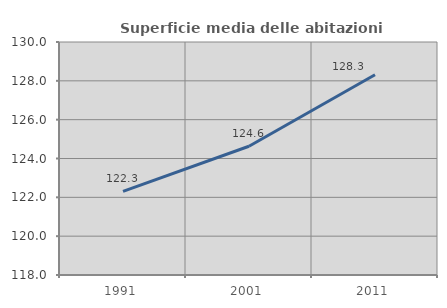
| Category | Superficie media delle abitazioni occupate |
|---|---|
| 1991.0 | 122.308 |
| 2001.0 | 124.629 |
| 2011.0 | 128.312 |